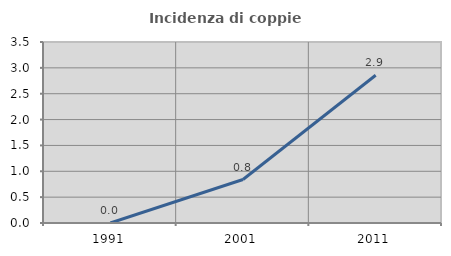
| Category | Incidenza di coppie miste |
|---|---|
| 1991.0 | 0 |
| 2001.0 | 0.84 |
| 2011.0 | 2.857 |